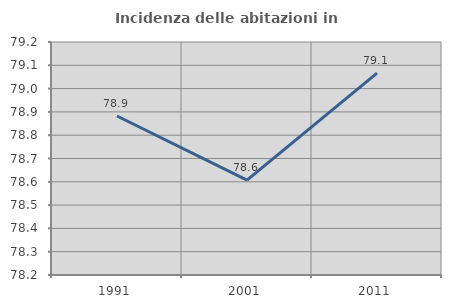
| Category | Incidenza delle abitazioni in proprietà  |
|---|---|
| 1991.0 | 78.882 |
| 2001.0 | 78.607 |
| 2011.0 | 79.067 |